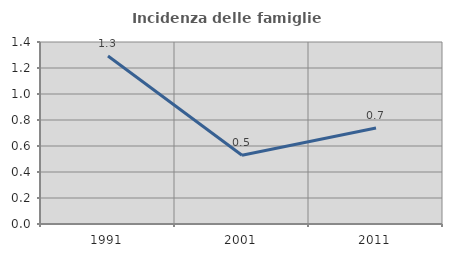
| Category | Incidenza delle famiglie numerose |
|---|---|
| 1991.0 | 1.292 |
| 2001.0 | 0.528 |
| 2011.0 | 0.739 |